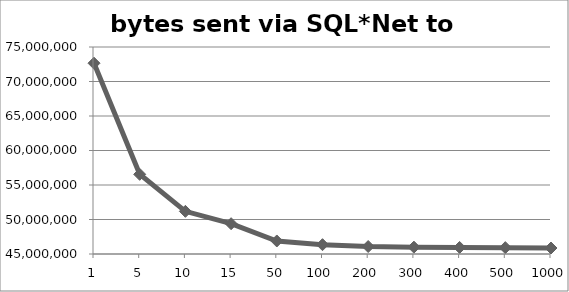
| Category | bytes sent via SQL*Net to client |
|---|---|
| 1.0 | 72650199 |
| 5.0 | 56548849 |
| 10.0 | 51181761 |
| 15.0 | 49392703 |
| 50.0 | 46888039 |
| 100.0 | 46351313 |
| 200.0 | 46082993 |
| 300.0 | 45993553 |
| 400.0 | 45948833 |
| 500.0 | 45922001 |
| 1000.0 | 45868337 |